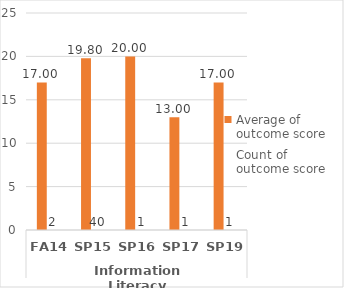
| Category | PTA.AAS - Average of outcome score | PTA.AAS - Count of outcome score |
|---|---|---|
| 0 | 17 | 2 |
| 1 | 19.8 | 40 |
| 2 | 20 | 1 |
| 3 | 13 | 1 |
| 4 | 17 | 1 |